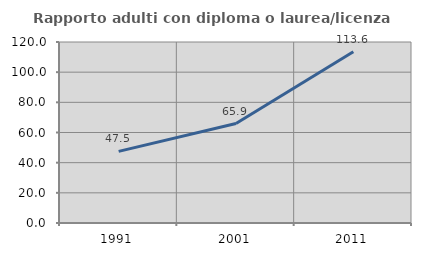
| Category | Rapporto adulti con diploma o laurea/licenza media  |
|---|---|
| 1991.0 | 47.473 |
| 2001.0 | 65.93 |
| 2011.0 | 113.573 |